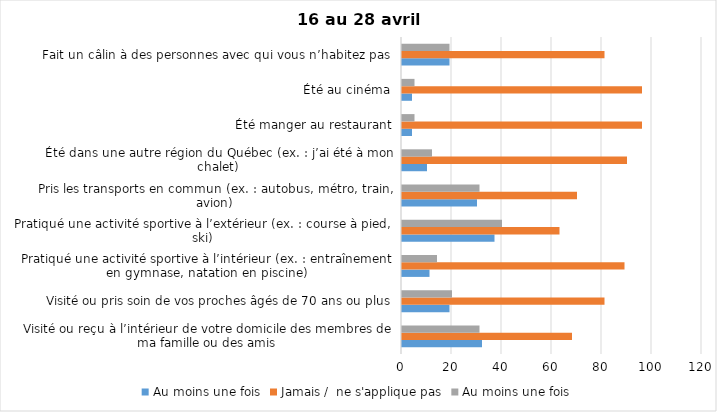
| Category | Au moins une fois | Jamais /  ne s'applique pas |
|---|---|---|
| Visité ou reçu à l’intérieur de votre domicile des membres de ma famille ou des amis | 31 | 68 |
| Visité ou pris soin de vos proches âgés de 70 ans ou plus | 20 | 81 |
| Pratiqué une activité sportive à l’intérieur (ex. : entraînement en gymnase, natation en piscine) | 14 | 89 |
| Pratiqué une activité sportive à l’extérieur (ex. : course à pied, ski) | 40 | 63 |
| Pris les transports en commun (ex. : autobus, métro, train, avion) | 31 | 70 |
| Été dans une autre région du Québec (ex. : j’ai été à mon chalet) | 12 | 90 |
| Été manger au restaurant | 5 | 96 |
| Été au cinéma | 5 | 96 |
| Fait un câlin à des personnes avec qui vous n’habitez pas | 19 | 81 |